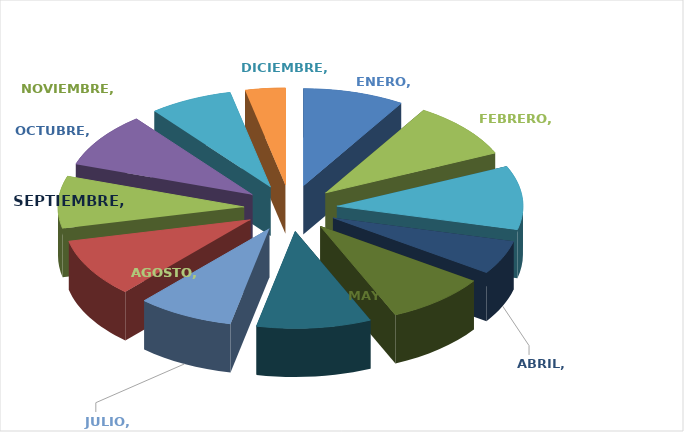
| Category | SOLICITUDES RECIBIDAS |
|---|---|
| ENERO | 493 |
| FEBRERO | 528 |
| MARZO | 595 |
| ABRIL | 317 |
| MAYO | 494 |
| JUNIO | 557 |
| JULIO | 469 |
| AGOSTO | 544 |
| SEPTIEMBRE | 485 |
| OCTUBRE | 513 |
| NOVIEMBRE | 404 |
| DICIEMBRE | 195 |